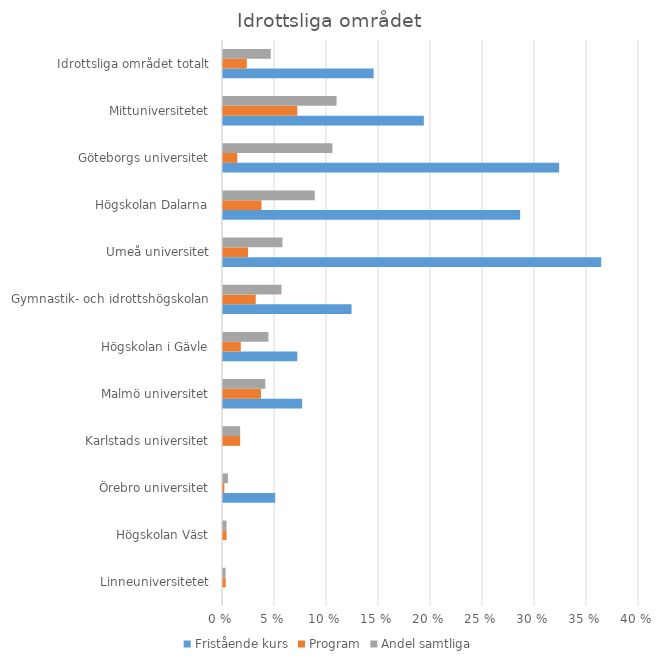
| Category | Fristående kurs | Program | Andel samtliga |
|---|---|---|---|
| Linneuniversitetet | 0 | 0.003 | 0.002 |
| Högskolan Väst | 0 | 0.003 | 0.003 |
| Örebro universitet | 0.05 | 0.001 | 0.005 |
| Karlstads universitet | 0 | 0.017 | 0.017 |
| Malmö universitet | 0.076 | 0.037 | 0.041 |
| Högskolan i Gävle | 0.071 | 0.017 | 0.044 |
| Gymnastik- och idrottshögskolan | 0.124 | 0.031 | 0.056 |
| Umeå universitet | 0.364 | 0.024 | 0.057 |
| Högskolan Dalarna | 0.286 | 0.037 | 0.088 |
| Göteborgs universitet | 0.323 | 0.014 | 0.105 |
| Mittuniversitetet | 0.193 | 0.071 | 0.109 |
| Idrottsliga området totalt | 0.145 | 0.023 | 0.046 |